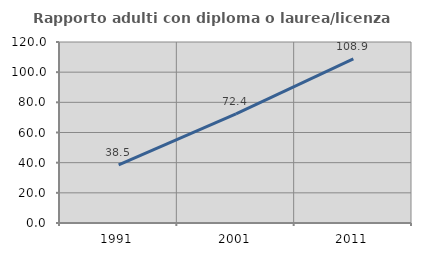
| Category | Rapporto adulti con diploma o laurea/licenza media  |
|---|---|
| 1991.0 | 38.532 |
| 2001.0 | 72.414 |
| 2011.0 | 108.871 |